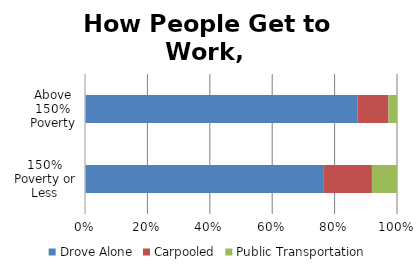
| Category | Drove Alone | Carpooled | Public Transportation |
|---|---|---|---|
| 150% Poverty or Less | 0.671 | 0.135 | 0.07 |
| Above 150% Poverty | 0.753 | 0.086 | 0.024 |